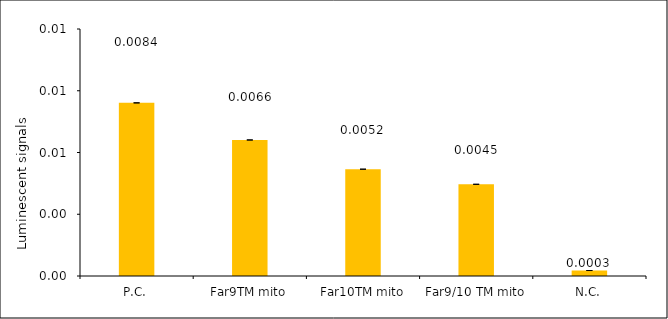
| Category | Series 0 |
|---|---|
| P.C. | 0.008 |
| Far9TM mito | 0.007 |
| Far10TM mito | 0.005 |
| Far9/10 TM mito | 0.004 |
| N.C. | 0 |